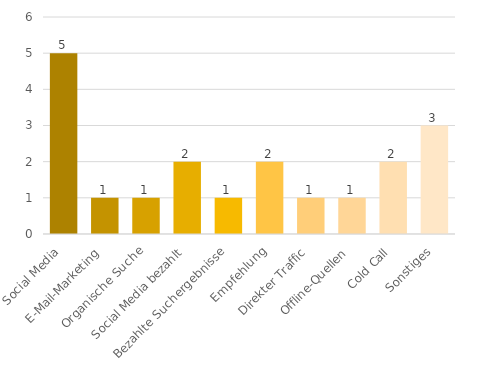
| Category | Series 0 |
|---|---|
| Social Media | 5 |
| E-Mail-Marketing | 1 |
| Organische Suche | 1 |
| Social Media bezahlt | 2 |
| Bezahlte Suchergebnisse | 1 |
| Empfehlung | 2 |
| Direkter Traffic | 1 |
| Offline-Quellen | 1 |
| Cold Call | 2 |
| Sonstiges | 3 |